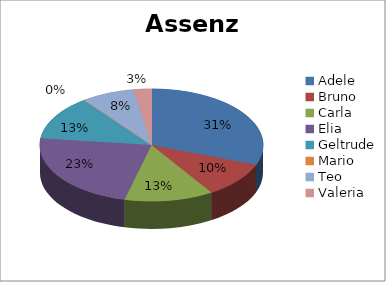
| Category | Assenze |
|---|---|
| Adele | 12 |
| Bruno | 4 |
| Carla | 5 |
| Elia | 9 |
| Geltrude | 5 |
| Mario | 0 |
| Teo | 3 |
| Valeria | 1 |